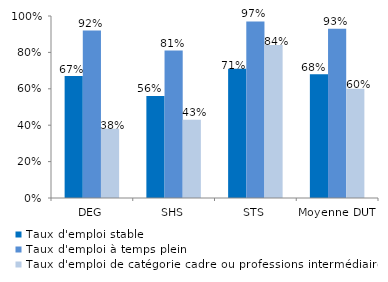
| Category | Taux d'emploi stable | Taux d'emploi à temps plein | Taux d'emploi de catégorie cadre ou professions intermédiaires |
|---|---|---|---|
| DEG | 0.67 | 0.92 | 0.38 |
| SHS | 0.56 | 0.81 | 0.43 |
| STS | 0.71 | 0.97 | 0.84 |
| Moyenne DUT | 0.68 | 0.93 | 0.6 |